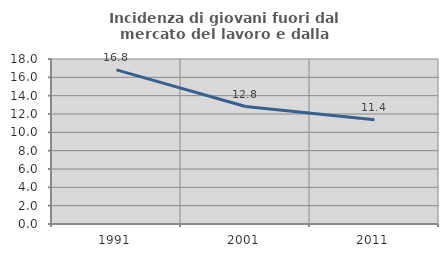
| Category | Incidenza di giovani fuori dal mercato del lavoro e dalla formazione  |
|---|---|
| 1991.0 | 16.814 |
| 2001.0 | 12.812 |
| 2011.0 | 11.371 |